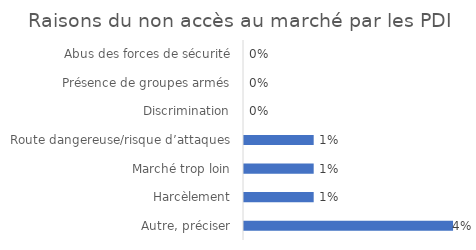
| Category | Fréquence |
|---|---|
|  Autre, préciser | 0.038 |
| Harcèlement | 0.012 |
| Marché trop loin | 0.012 |
| Route dangereuse/risque d’attaques | 0.012 |
| Discrimination | 0 |
| Présence de groupes armés | 0 |
| Abus des forces de sécurité | 0 |